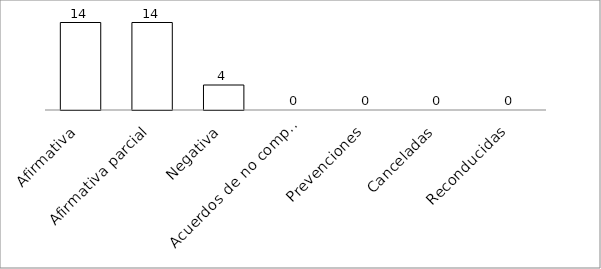
| Category | Series 0 |
|---|---|
| Afirmativa | 14 |
| Afirmativa parcial | 14 |
| Negativa | 4 |
| Acuerdos de no competencia | 0 |
| Prevenciones | 0 |
| Canceladas | 0 |
| Reconducidas | 0 |